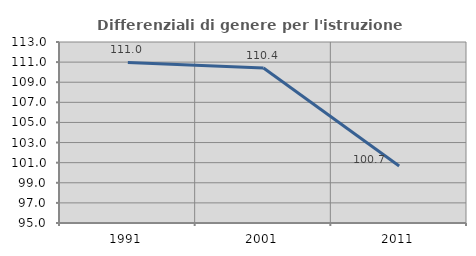
| Category | Differenziali di genere per l'istruzione superiore |
|---|---|
| 1991.0 | 110.963 |
| 2001.0 | 110.421 |
| 2011.0 | 100.668 |